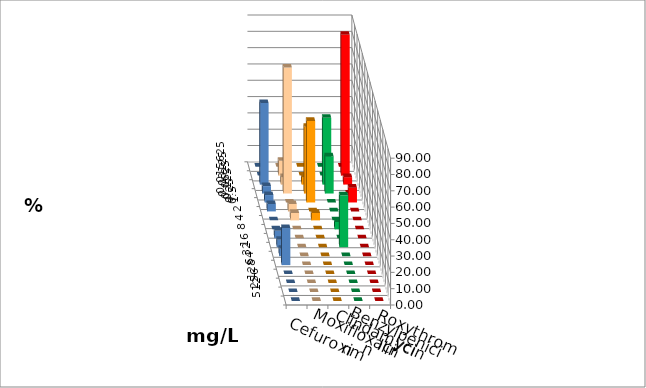
| Category | Cefuroxim | Moxifloxacin | Clindamycin | Benzylpenicillin | Roxythromycin |
|---|---|---|---|---|---|
| 0.015625 | 0 | 0 | 0 | 0 | 0 |
| 0.03125 | 9.091 | 0 | 0 | 86.364 | 0 |
| 0.0625 | 4.545 | 4.545 | 40.909 | 4.545 | 50 |
| 0.125 | 77.273 | 40.909 | 22.727 | 0 | 4.545 |
| 0.25 | 0 | 50 | 0 | 9.091 | 4.545 |
| 0.5 | 4.545 | 0 | 0 | 0 | 4.545 |
| 1.0 | 4.545 | 4.545 | 0 | 0 | 0 |
| 2.0 | 0 | 0 | 4.545 | 0 | 0 |
| 4.0 | 0 | 0 | 0 | 0 | 4.545 |
| 8.0 | 0 | 0 | 31.818 | 0 | 4.545 |
| 16.0 | 0 | 0 | 0 | 0 | 4.545 |
| 32.0 | 0 | 0 | 0 | 0 | 22.727 |
| 64.0 | 0 | 0 | 0 | 0 | 0 |
| 128.0 | 0 | 0 | 0 | 0 | 0 |
| 256.0 | 0 | 0 | 0 | 0 | 0 |
| 512.0 | 0 | 0 | 0 | 0 | 0 |